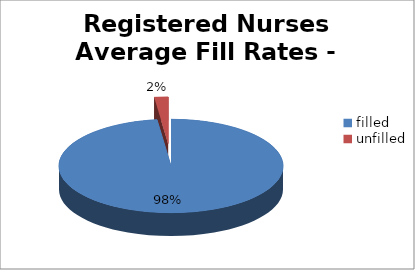
| Category | Series 0 |
|---|---|
| filled  | 98 |
| unfilled | 2 |